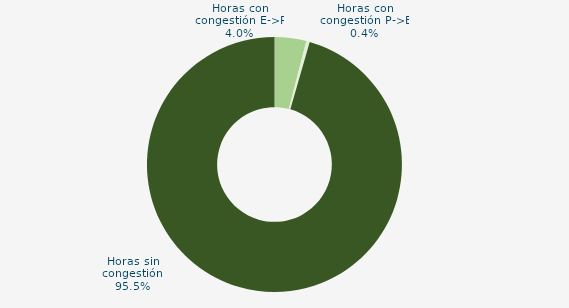
| Category | Horas con congestión E->P |
|---|---|
| Horas con congestión E->P | 4.023 |
| Horas con congestión P->E | 0.431 |
| Horas sin congestión | 95.546 |